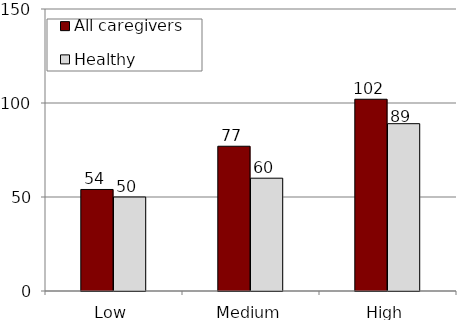
| Category | All caregivers | Healthy caregivers |
|---|---|---|
| Low | 54 | 50 |
| Medium | 77 | 60 |
| High | 102 | 89 |